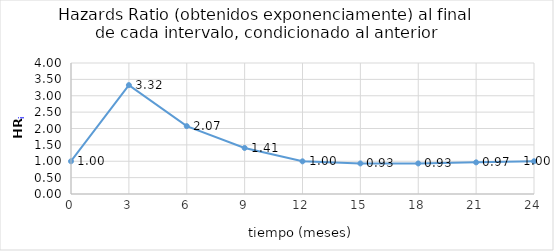
| Category | HRi |
|---|---|
| 0.0 | 1 |
| 3.0 | 3.325 |
| 6.0 | 2.072 |
| 9.0 | 1.406 |
| 12.0 | 0.998 |
| 15.0 | 0.934 |
| 18.0 | 0.933 |
| 21.0 | 0.966 |
| 24.0 | 0.999 |